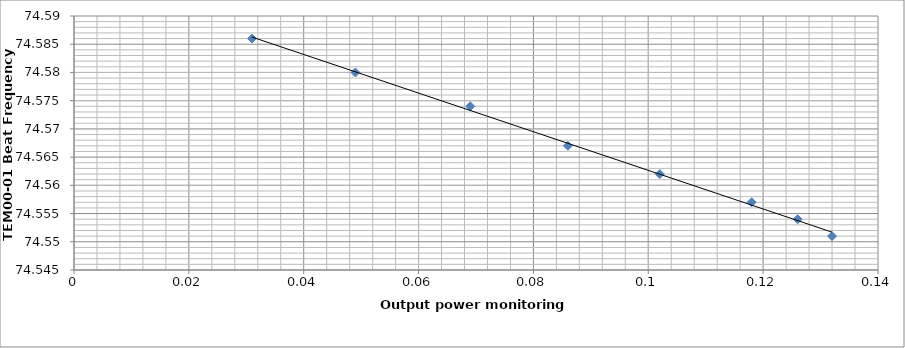
| Category | Series 0 |
|---|---|
| 0.132 | 74.551 |
| 0.126 | 74.554 |
| 0.118 | 74.557 |
| 0.102 | 74.562 |
| 0.086 | 74.567 |
| 0.069 | 74.574 |
| 0.049 | 74.58 |
| 0.031 | 74.586 |